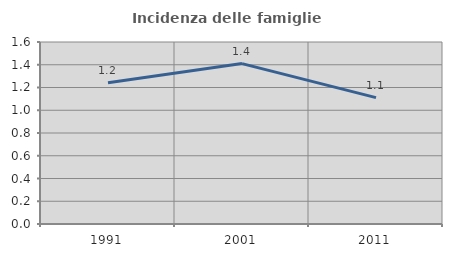
| Category | Incidenza delle famiglie numerose |
|---|---|
| 1991.0 | 1.241 |
| 2001.0 | 1.41 |
| 2011.0 | 1.111 |